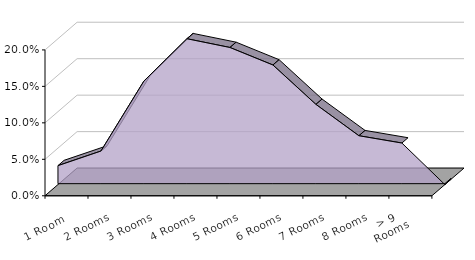
| Category | Monroe |
|---|---|
| 1 Room | 0.026 |
| 2 Rooms | 0.046 |
| 3 Rooms | 0.142 |
| 4 Rooms | 0.2 |
| 5 Rooms | 0.188 |
| 6 Rooms | 0.164 |
| 7 Rooms | 0.11 |
| 8 Rooms | 0.067 |
| > 9 Rooms | 0.057 |